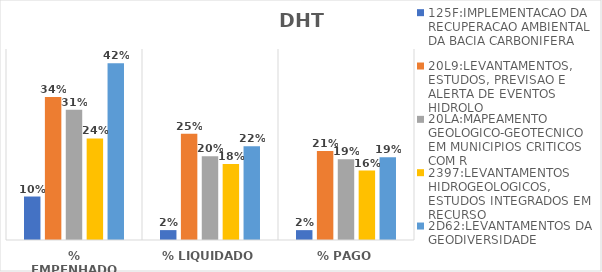
| Category | 125F:IMPLEMENTACAO DA RECUPERACAO AMBIENTAL DA BACIA CARBONIFERA | 20L9:LEVANTAMENTOS, ESTUDOS, PREVISAO E ALERTA DE EVENTOS HIDROLO | 20LA:MAPEAMENTO GEOLOGICO-GEOTECNICO EM MUNICIPIOS CRITICOS COM R | 2397:LEVANTAMENTOS HIDROGEOLOGICOS, ESTUDOS INTEGRADOS EM RECURSO | 2D62:LEVANTAMENTOS DA GEODIVERSIDADE |
|---|---|---|---|---|---|
| % EMPENHADO | 0.102 | 0.337 | 0.307 | 0.239 | 0.417 |
| % LIQUIDADO | 0.023 | 0.25 | 0.197 | 0.179 | 0.221 |
| % PAGO | 0.023 | 0.209 | 0.19 | 0.164 | 0.195 |